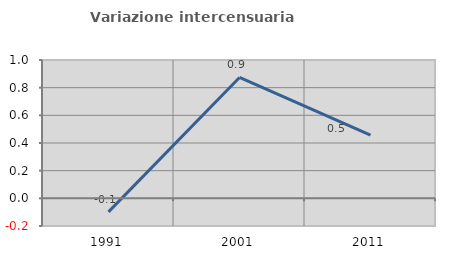
| Category | Variazione intercensuaria annua |
|---|---|
| 1991.0 | -0.098 |
| 2001.0 | 0.874 |
| 2011.0 | 0.458 |